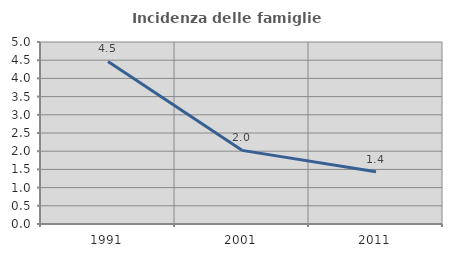
| Category | Incidenza delle famiglie numerose |
|---|---|
| 1991.0 | 4.465 |
| 2001.0 | 2.023 |
| 2011.0 | 1.438 |